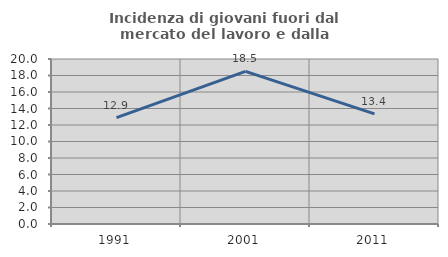
| Category | Incidenza di giovani fuori dal mercato del lavoro e dalla formazione  |
|---|---|
| 1991.0 | 12.898 |
| 2001.0 | 18.502 |
| 2011.0 | 13.356 |